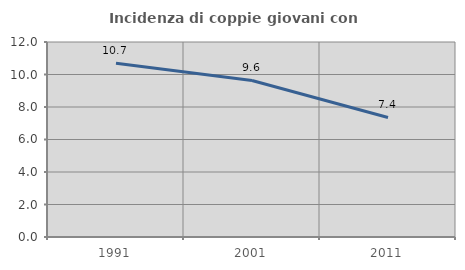
| Category | Incidenza di coppie giovani con figli |
|---|---|
| 1991.0 | 10.694 |
| 2001.0 | 9.632 |
| 2011.0 | 7.357 |